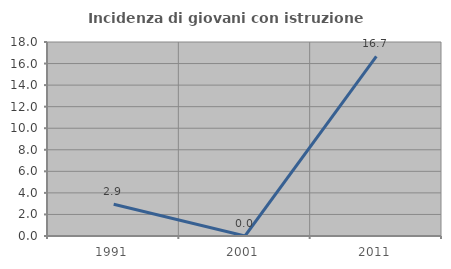
| Category | Incidenza di giovani con istruzione universitaria |
|---|---|
| 1991.0 | 2.941 |
| 2001.0 | 0 |
| 2011.0 | 16.667 |